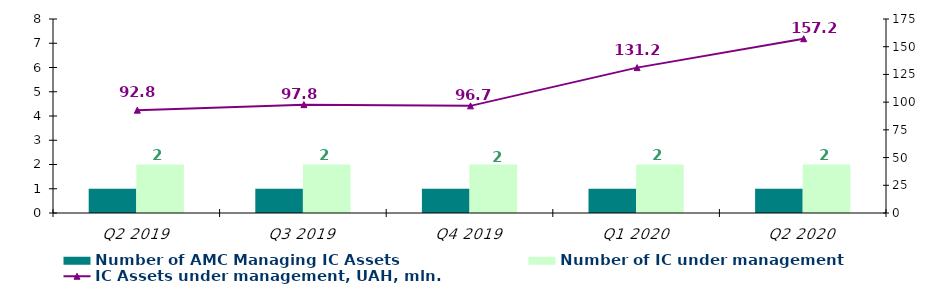
| Category | Number of AMC Managing IC Assets | Number of IC under management |
|---|---|---|
| Q2 2019 | 1 | 2 |
| Q3 2019 | 1 | 2 |
| Q4 2019 | 1 | 2 |
| Q1 2020 | 1 | 2 |
| Q2 2020 | 1 | 2 |